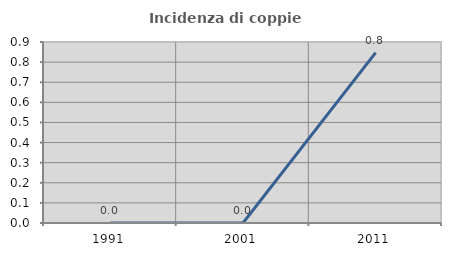
| Category | Incidenza di coppie miste |
|---|---|
| 1991.0 | 0 |
| 2001.0 | 0 |
| 2011.0 | 0.847 |